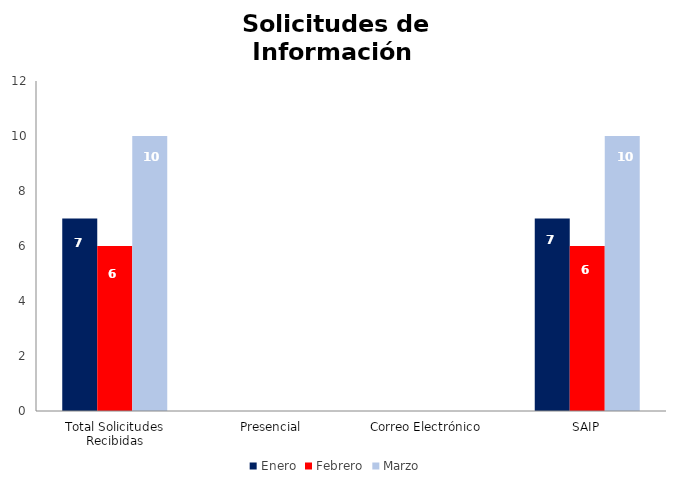
| Category | Enero | Febrero | Marzo |
|---|---|---|---|
| Total Solicitudes Recibidas | 7 | 6 | 10 |
| Presencial | 0 | 0 | 0 |
| Correo Electrónico  | 0 | 0 | 0 |
| SAIP | 7 | 6 | 10 |